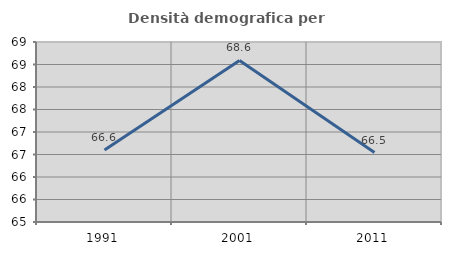
| Category | Densità demografica |
|---|---|
| 1991.0 | 66.602 |
| 2001.0 | 68.59 |
| 2011.0 | 66.543 |